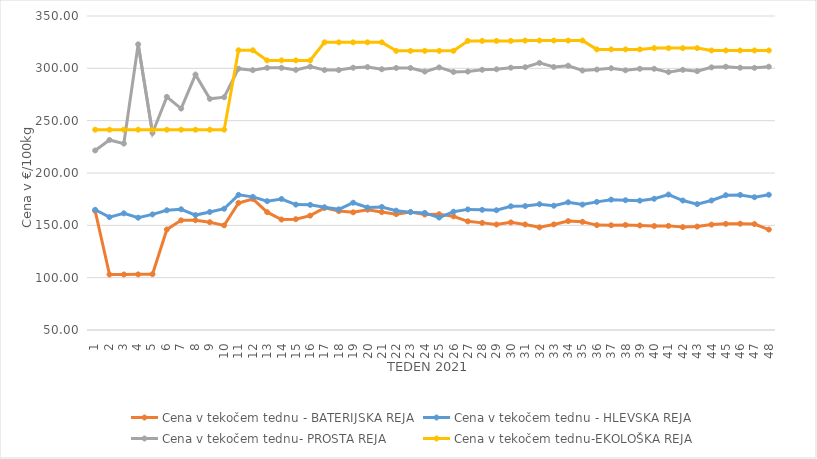
| Category | Cena v tekočem tednu - BATERIJSKA REJA | Cena v tekočem tednu - HLEVSKA REJA | Cena v tekočem tednu- PROSTA REJA | Cena v tekočem tednu-EKOLOŠKA REJA |
|---|---|---|---|---|
| 1.0 | 163.81 | 164.86 | 221.55 | 241.38 |
| 2.0 | 103.02 | 157.81 | 231.55 | 241.38 |
| 3.0 | 103.03 | 161.48 | 228.1 | 241.38 |
| 4.0 | 103.15 | 157.29 | 322.93 | 241.38 |
| 5.0 | 103.34 | 160.43 | 238.28 | 241.38 |
| 6.0 | 146.03 | 164.39 | 272.76 | 241.38 |
| 7.0 | 154.77 | 165.34 | 261.55 | 241.38 |
| 8.0 | 154.86 | 159.79 | 293.97 | 241.38 |
| 9.0 | 153 | 162.73 | 270.86 | 241.38 |
| 10.0 | 149.98 | 165.85 | 272.41 | 241.38 |
| 11.0 | 171.4 | 179.09 | 299.66 | 317.24 |
| 12.0 | 175.2 | 177.21 | 298.27 | 317.24 |
| 13.0 | 162.57 | 173.07 | 300.45 | 307.59 |
| 14.0 | 155.55 | 175.17 | 300.49 | 307.59 |
| 15.0 | 155.88 | 169.83 | 298.52 | 307.59 |
| 16.0 | 159.26 | 169.55 | 301.6 | 307.59 |
| 17.0 | 166.66 | 167.25 | 298.38 | 324.83 |
| 18.0 | 163.58 | 165.28 | 298.35 | 324.83 |
| 19.0 | 162.44 | 171.6 | 300.59 | 324.83 |
| 20.0 | 164.94 | 167.01 | 301.21 | 324.83 |
| 21.0 | 162.64 | 167.56 | 299.14 | 324.83 |
| 22.0 | 160.68 | 164.01 | 300.34 | 316.72 |
| 23.0 | 162.75 | 162.58 | 300.35 | 316.72 |
| 24.0 | 160.34 | 161.89 | 296.9 | 316.72 |
| 25.0 | 160.61 | 157.42 | 300.86 | 316.72 |
| 26.0 | 158.57 | 163.03 | 296.55 | 316.72 |
| 27.0 | 153.83 | 165.23 | 296.9 | 326.21 |
| 28.0 | 152.35 | 164.83 | 298.63 | 326.21 |
| 29.0 | 150.79 | 164.42 | 299.08 | 326.21 |
| 30.0 | 152.82 | 168.2 | 300.63 | 326.21 |
| 31.0 | 150.8 | 168.4 | 301.07 | 326.55 |
| 32.0 | 148.1 | 170.19 | 305.2 | 326.55 |
| 33.0 | 150.88 | 168.74 | 301.25 | 326.55 |
| 34.0 | 154.04 | 172.03 | 302.51 | 326.55 |
| 35.0 | 153.37 | 169.81 | 297.92 | 326.55 |
| 36.0 | 150.21 | 172.4 | 298.86 | 318.1 |
| 37.0 | 150.06 | 174.54 | 300.07 | 318.1 |
| 38.0 | 150.32 | 173.99 | 298.12 | 318.1 |
| 39.0 | 149.86 | 173.58 | 299.58 | 318.1 |
| 40.0 | 149.34 | 175.36 | 299.56 | 319.31 |
| 41.0 | 149.48 | 179.4 | 296.38 | 319.31 |
| 42.0 | 148.32 | 173.69 | 298.56 | 319.31 |
| 43.0 | 148.83 | 170.3 | 297.28 | 319.31 |
| 44.0 | 150.69 | 173.75 | 300.93 | 317.07 |
| 45.0 | 151.41 | 178.77 | 301.53 | 317.07 |
| 46.0 | 151.56 | 179.05 | 300.59 | 317.07 |
| 47.0 | 151.2 | 176.86 | 300.49 | 317.07 |
| 48.0 | 145.97 | 179.22 | 301.57 | 317.07 |